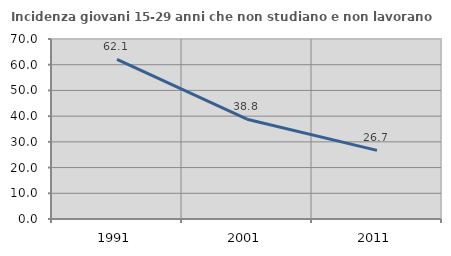
| Category | Incidenza giovani 15-29 anni che non studiano e non lavorano  |
|---|---|
| 1991.0 | 62.118 |
| 2001.0 | 38.797 |
| 2011.0 | 26.703 |